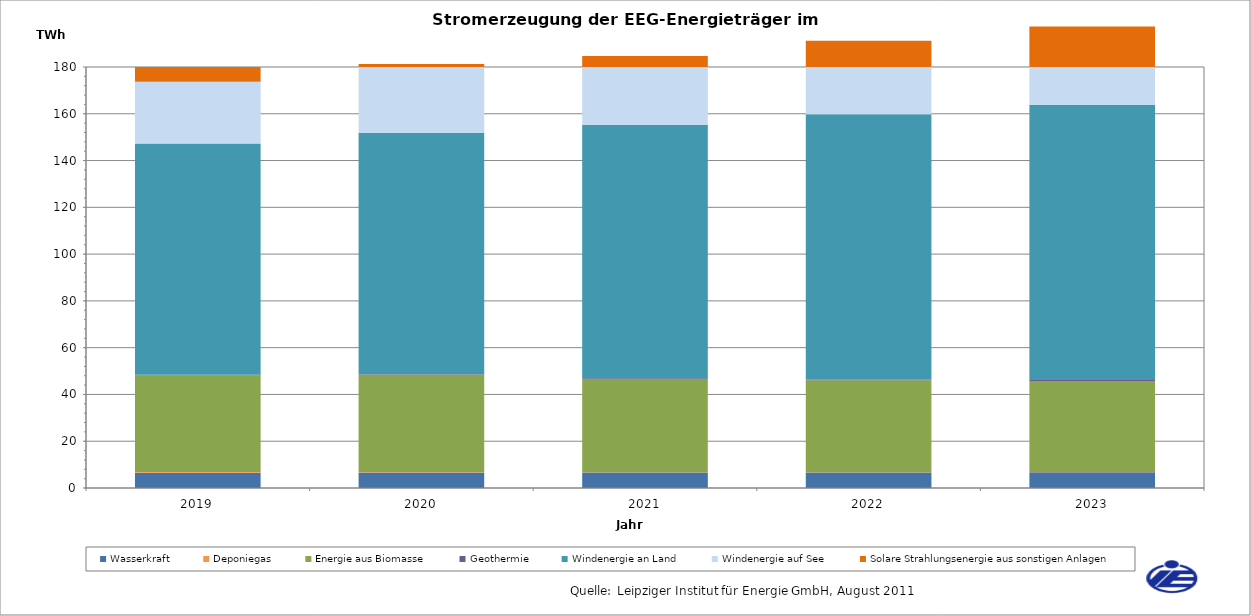
| Category | Wasserkraft | Deponiegas | Energie aus Biomasse | Geothermie | Windenergie an Land | Windenergie auf See | Solare Strahlungsenergie aus sonstigen Anlagen |
|---|---|---|---|---|---|---|---|
| 2019 | 6514.587 | 301.193 | 41351.62 | 286.386 | 98799.183 | 26466.161 | 29472.576 |
| 2020 | 6579.213 | 279.403 | 41517.18 | 311.858 | 103214.502 | 29387.973 | 31131.168 |
| 2021 | 6607.816 | 143.241 | 39872.884 | 335.633 | 108375.196 | 29373.851 | 32698.217 |
| 2022 | 6654.341 | 106.025 | 39296.779 | 360.21 | 113428.189 | 31352.828 | 33999.158 |
| 2023 | 6700.926 | 94.786 | 38943.147 | 384.818 | 117767.902 | 33371.728 | 34914.597 |